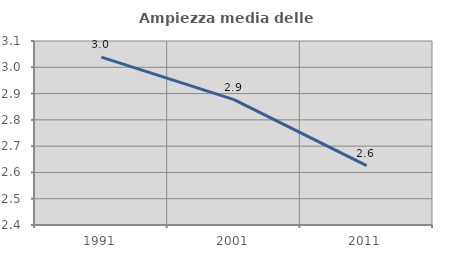
| Category | Ampiezza media delle famiglie |
|---|---|
| 1991.0 | 3.038 |
| 2001.0 | 2.877 |
| 2011.0 | 2.626 |